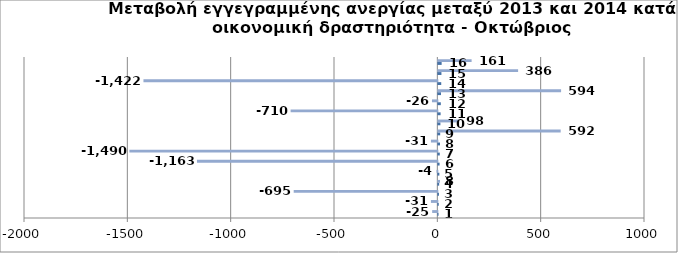
| Category | Series 0 | Series 1 |
|---|---|---|
| 0 | 1 | -25 |
| 1 | 2 | -31 |
| 2 | 3 | -695 |
| 3 | 4 | 8 |
| 4 | 5 | -4 |
| 5 | 6 | -1163 |
| 6 | 7 | -1490 |
| 7 | 8 | -31 |
| 8 | 9 | 592 |
| 9 | 10 | 98 |
| 10 | 11 | -710 |
| 11 | 12 | -26 |
| 12 | 13 | 594 |
| 13 | 14 | -1422 |
| 14 | 15 | 386 |
| 15 | 16 | 161 |